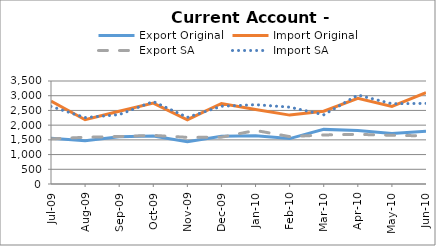
| Category | Export Original | Import Original | Export SA | Import SA |
|---|---|---|---|---|
| 2009-07-31 | 1559 | 2815 | 1533 | 2636 |
| 2009-08-31 | 1471 | 2183 | 1588 | 2257 |
| 2009-09-30 | 1606 | 2470 | 1614 | 2358 |
| 2009-10-31 | 1632 | 2747 | 1652 | 2802 |
| 2009-11-30 | 1433 | 2184 | 1585 | 2265 |
| 2009-12-31 | 1619 | 2736 | 1591 | 2642 |
| 2010-01-31 | 1636 | 2533 | 1820 | 2695 |
| 2010-02-28 | 1543 | 2341 | 1611 | 2612 |
| 2010-03-31 | 1856 | 2474 | 1666 | 2351 |
| 2010-04-30 | 1819 | 2914 | 1687 | 3023 |
| 2010-05-31 | 1717 | 2633 | 1655 | 2728 |
| 2010-06-30 | 1789 | 3102 | 1635 | 2739 |